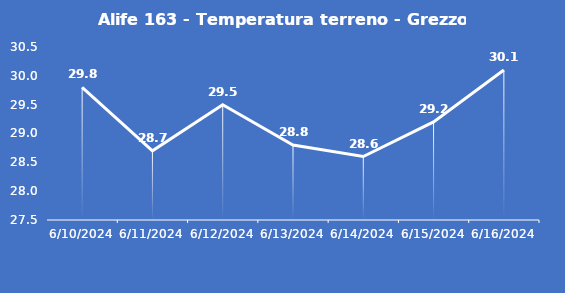
| Category | Alife 163 - Temperatura terreno - Grezzo (°C) |
|---|---|
| 6/10/24 | 29.8 |
| 6/11/24 | 28.7 |
| 6/12/24 | 29.5 |
| 6/13/24 | 28.8 |
| 6/14/24 | 28.6 |
| 6/15/24 | 29.2 |
| 6/16/24 | 30.1 |